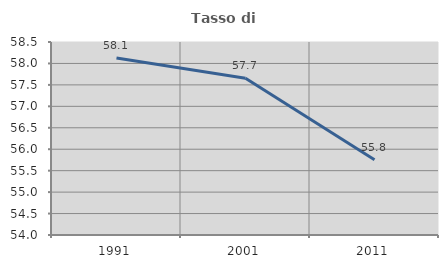
| Category | Tasso di occupazione   |
|---|---|
| 1991.0 | 58.126 |
| 2001.0 | 57.654 |
| 2011.0 | 55.756 |